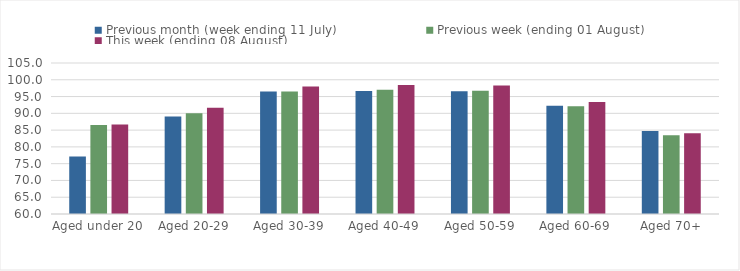
| Category | Previous month (week ending 11 July) | Previous week (ending 01 August) | This week (ending 08 August) |
|---|---|---|---|
| Aged under 20 | 77.135 | 86.495 | 86.673 |
| Aged 20-29 | 89.072 | 89.998 | 91.627 |
| Aged 30-39 | 96.518 | 96.542 | 97.989 |
| Aged 40-49 | 96.628 | 97.025 | 98.409 |
| Aged 50-59 | 96.562 | 96.708 | 98.265 |
| Aged 60-69 | 92.283 | 92.123 | 93.413 |
| Aged 70+ | 84.763 | 83.49 | 84.05 |